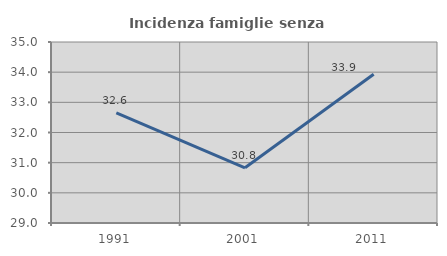
| Category | Incidenza famiglie senza nuclei |
|---|---|
| 1991.0 | 32.648 |
| 2001.0 | 30.829 |
| 2011.0 | 33.929 |